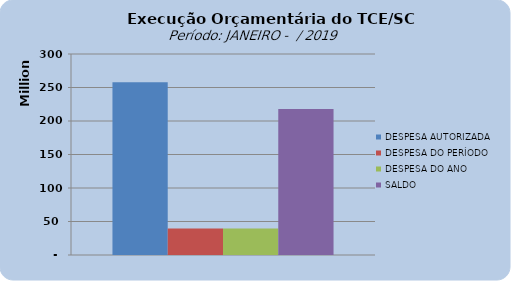
| Category | DESPESA AUTORIZADA | DESPESA DO PERÍODO | DESPESA DO ANO | SALDO |
|---|---|---|---|---|
| 0 | 257750397.15 | 39667168.58 | 39667168.58 | 218083228.57 |